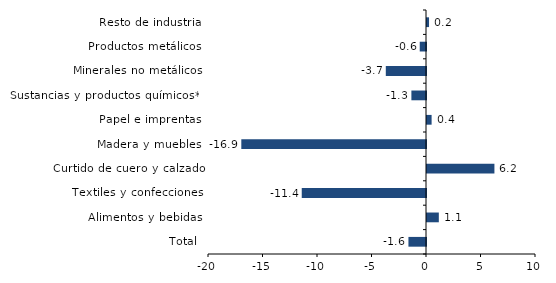
| Category | Series 0 |
|---|---|
| Total | -1.611 |
| Alimentos y bebidas | 1.084 |
| Textiles y confecciones | -11.4 |
| Curtido de cuero y calzado | 6.185 |
| Madera y muebles | -16.944 |
| Papel e imprentas | 0.423 |
| Sustancias y productos químicos** | -1.34 |
| Minerales no metálicos | -3.688 |
| Productos metálicos | -0.575 |
| Resto de industria | 0.187 |